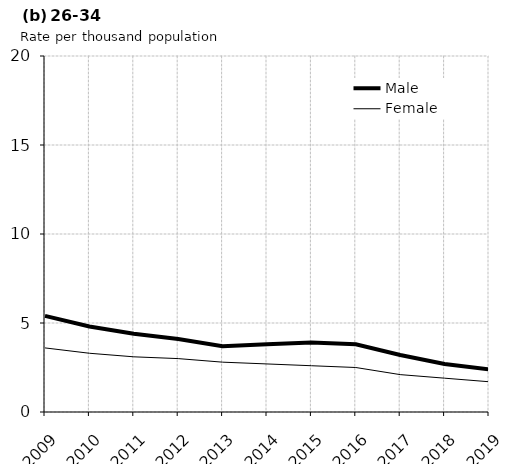
| Category | Male | Female |
|---|---|---|
| 2009.0 | 5.4 | 3.6 |
| 2010.0 | 4.8 | 3.3 |
| 2011.0 | 4.4 | 3.1 |
| 2012.0 | 4.1 | 3 |
| 2013.0 | 3.7 | 2.8 |
| 2014.0 | 3.8 | 2.7 |
| 2015.0 | 3.9 | 2.6 |
| 2016.0 | 3.8 | 2.5 |
| 2017.0 | 3.2 | 2.1 |
| 2018.0 | 2.7 | 1.9 |
| 2019.0 | 2.4 | 1.7 |